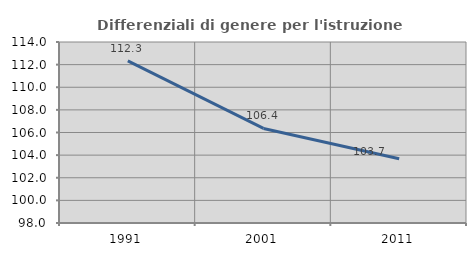
| Category | Differenziali di genere per l'istruzione superiore |
|---|---|
| 1991.0 | 112.326 |
| 2001.0 | 106.358 |
| 2011.0 | 103.678 |